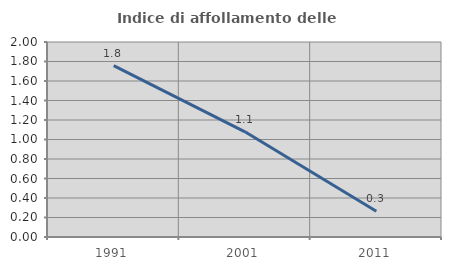
| Category | Indice di affollamento delle abitazioni  |
|---|---|
| 1991.0 | 1.758 |
| 2001.0 | 1.079 |
| 2011.0 | 0.265 |